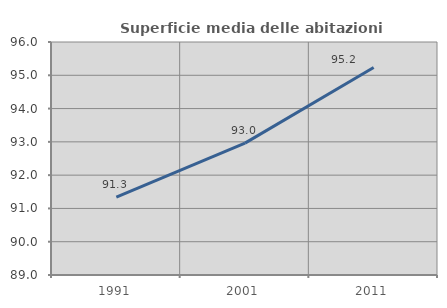
| Category | Superficie media delle abitazioni occupate |
|---|---|
| 1991.0 | 91.342 |
| 2001.0 | 92.961 |
| 2011.0 | 95.236 |